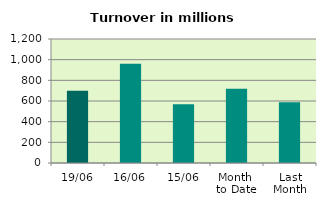
| Category | Series 0 |
|---|---|
| 19/06 | 698.003 |
| 16/06 | 960.078 |
| 15/06 | 569.442 |
| Month 
to Date | 718.561 |
| Last
Month | 587.249 |